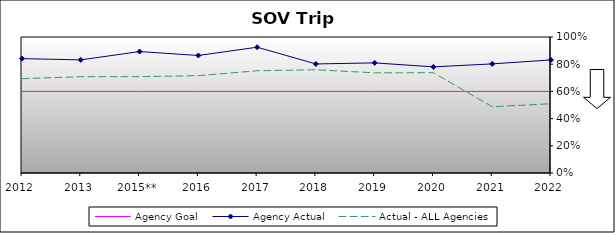
| Category | Agency Goal | Agency Actual | Actual - ALL Agencies |
|---|---|---|---|
| 2012 | 0.6 | 0.841 | 0.694 |
| 2013 | 0.6 | 0.832 | 0.708 |
| 2015** | 0.6 | 0.893 | 0.708 |
| 2016 | 0.6 | 0.864 | 0.716 |
| 2017 | 0.6 | 0.925 | 0.752 |
| 2018 | 0.6 | 0.802 | 0.759 |
| 2019 | 0.6 | 0.81 | 0.736 |
| 2020 | 0.6 | 0.78 | 0.737 |
| 2021 | 0.6 | 0.802 | 0.487 |
| 2022 | 0.6 | 0.831 | 0.509 |